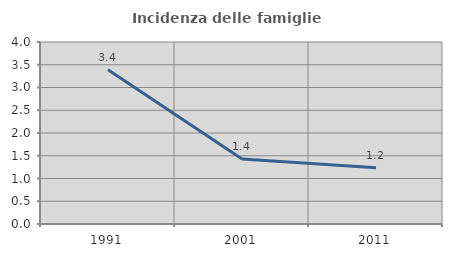
| Category | Incidenza delle famiglie numerose |
|---|---|
| 1991.0 | 3.389 |
| 2001.0 | 1.428 |
| 2011.0 | 1.235 |